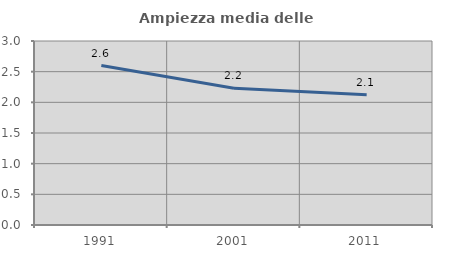
| Category | Ampiezza media delle famiglie |
|---|---|
| 1991.0 | 2.6 |
| 2001.0 | 2.229 |
| 2011.0 | 2.125 |